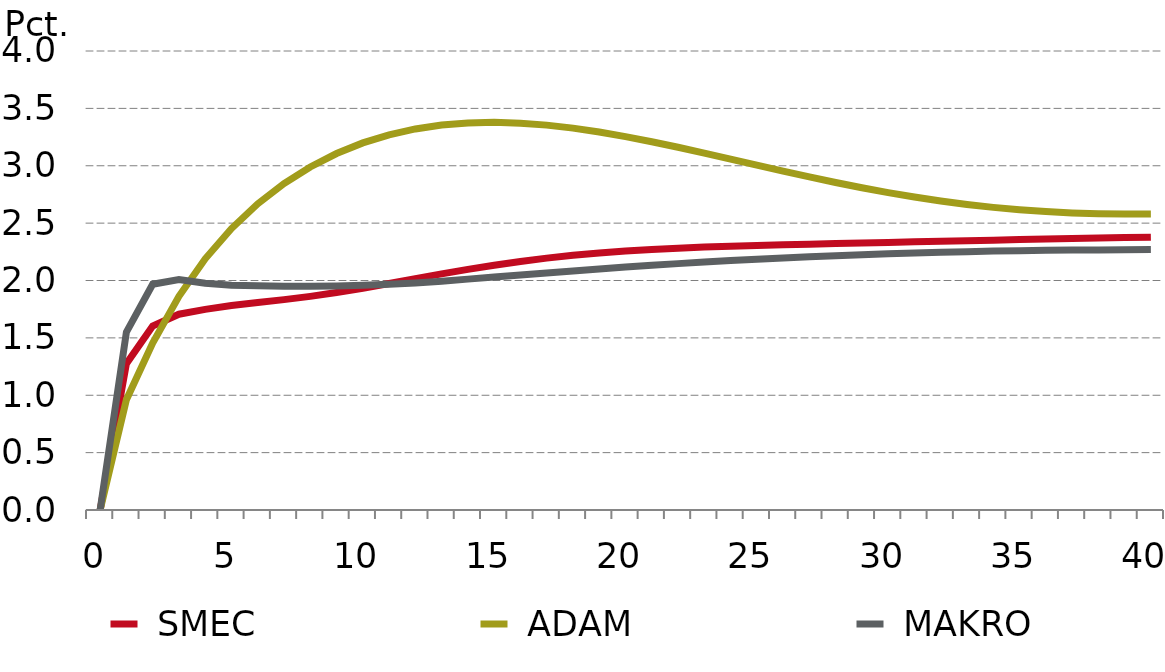
| Category |  SMEC |  ADAM |  MAKRO |
|---|---|---|---|
| 0.0 | 0 | 0 | 0 |
| nan | 1.275 | 0.961 | 1.551 |
| nan | 1.602 | 1.455 | 1.967 |
| nan | 1.706 | 1.863 | 2.009 |
| nan | 1.749 | 2.189 | 1.976 |
| 5.0 | 1.781 | 2.453 | 1.959 |
| nan | 1.808 | 2.668 | 1.954 |
| nan | 1.833 | 2.845 | 1.951 |
| nan | 1.862 | 2.99 | 1.951 |
| nan | 1.895 | 3.107 | 1.953 |
| 10.0 | 1.933 | 3.199 | 1.959 |
| nan | 1.974 | 3.27 | 1.967 |
| nan | 2.016 | 3.321 | 1.978 |
| nan | 2.057 | 3.355 | 1.994 |
| nan | 2.097 | 3.373 | 2.012 |
| 15.0 | 2.134 | 3.378 | 2.03 |
| nan | 2.166 | 3.371 | 2.048 |
| nan | 2.195 | 3.354 | 2.065 |
| nan | 2.219 | 3.328 | 2.083 |
| nan | 2.24 | 3.294 | 2.1 |
| 20.0 | 2.257 | 3.254 | 2.117 |
| nan | 2.271 | 3.209 | 2.133 |
| nan | 2.282 | 3.161 | 2.147 |
| nan | 2.291 | 3.11 | 2.161 |
| nan | 2.299 | 3.058 | 2.174 |
| 25.0 | 2.305 | 3.005 | 2.186 |
| nan | 2.311 | 2.953 | 2.197 |
| nan | 2.317 | 2.903 | 2.206 |
| nan | 2.322 | 2.854 | 2.216 |
| nan | 2.327 | 2.808 | 2.225 |
| 30.0 | 2.332 | 2.766 | 2.233 |
| nan | 2.337 | 2.727 | 2.24 |
| nan | 2.342 | 2.693 | 2.246 |
| nan | 2.347 | 2.663 | 2.251 |
| nan | 2.352 | 2.637 | 2.256 |
| 35.0 | 2.356 | 2.617 | 2.26 |
| nan | 2.361 | 2.6 | 2.263 |
| nan | 2.366 | 2.589 | 2.265 |
| nan | 2.37 | 2.582 | 2.267 |
| nan | 2.374 | 2.579 | 2.268 |
| 40.0 | 2.378 | 2.58 | 2.269 |